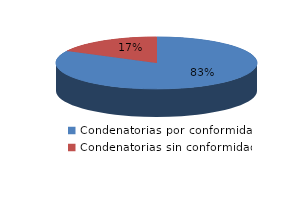
| Category | Series 0 |
|---|---|
| 0 | 1424 |
| 1 | 301 |